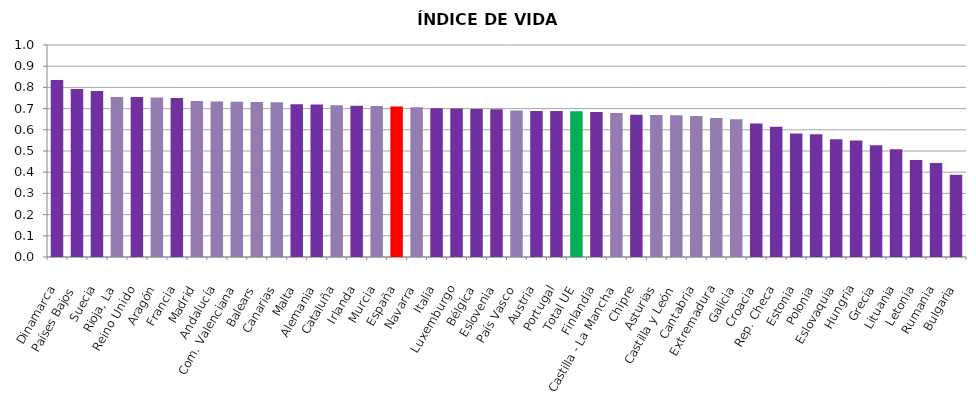
| Category | Series 0 |
|---|---|
| Dinamarca | 0.835 |
| Países Bajos | 0.792 |
| Suecia | 0.784 |
| Rioja, La | 0.755 |
| Reino Unido | 0.755 |
| Aragón | 0.753 |
| Francia | 0.75 |
| Madrid | 0.736 |
| Andalucía | 0.733 |
| Com. Valenciana | 0.732 |
| Balears | 0.732 |
| Canarias | 0.73 |
| Malta | 0.72 |
| Alemania | 0.719 |
| Cataluña | 0.715 |
| Irlanda | 0.713 |
| Murcia | 0.712 |
| España | 0.71 |
| Navarra | 0.707 |
| Italia | 0.702 |
| Luxemburgo | 0.701 |
| Bélgica | 0.698 |
| Eslovenia | 0.697 |
| País Vasco | 0.691 |
| Austria | 0.689 |
| Portugal | 0.688 |
| Total UE | 0.687 |
| Finlandia | 0.684 |
| Castilla - La Mancha | 0.679 |
| Chipre | 0.671 |
| Asturias | 0.67 |
| Castilla y León | 0.669 |
| Cantabria | 0.665 |
| Extremadura | 0.655 |
| Galicia | 0.649 |
| Croacia | 0.63 |
| Rep. Checa | 0.614 |
| Estonia | 0.583 |
| Polonia | 0.579 |
| Eslovaquia | 0.556 |
| Hungría | 0.55 |
| Grecia | 0.528 |
| Lituania | 0.508 |
| Letonia | 0.458 |
| Rumania | 0.443 |
| Bulgaria | 0.388 |